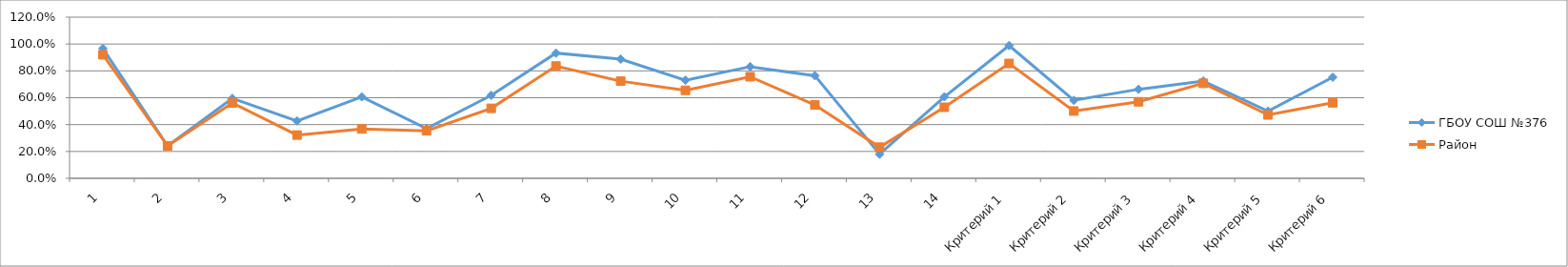
| Category | ГБОУ СОШ №376 | Район |
|---|---|---|
| 1 | 0.966 | 0.92 |
| 2 | 0.242 | 0.241 |
| 3 | 0.596 | 0.561 |
| 4 | 0.427 | 0.322 |
| 5 | 0.607 | 0.368 |
| 6 | 0.371 | 0.354 |
| 7 | 0.618 | 0.521 |
| 8 | 0.933 | 0.836 |
| 9 | 0.888 | 0.723 |
| 10 | 0.73 | 0.655 |
| 11 | 0.831 | 0.756 |
| 12 | 0.764 | 0.546 |
| 13 | 0.18 | 0.232 |
| 14 | 0.607 | 0.529 |
| Критерий 1 | 0.989 | 0.855 |
| Критерий 2 | 0.581 | 0.501 |
| Критерий 3 | 0.663 | 0.57 |
| Критерий 4 | 0.725 | 0.707 |
| Критерий 5 | 0.5 | 0.472 |
| Критерий 6 | 0.753 | 0.562 |